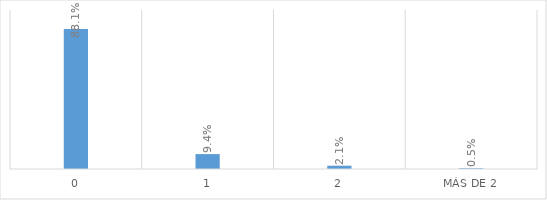
| Category | Series 0 |
|---|---|
| 0 | 0.881 |
| 1 | 0.094 |
| 2 | 0.021 |
| Más de 2 | 0.005 |